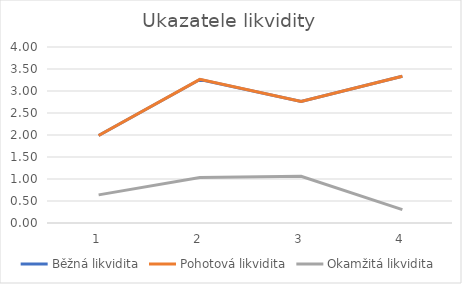
| Category | Běžná likvidita | Pohotová likvidita | Okamžitá likvidita |
|---|---|---|---|
| 0 | 1.99 | 1.987 | 0.639 |
| 1 | 3.26 | 3.264 | 1.035 |
| 2 | 2.76 | 2.761 | 1.062 |
| 3 | 3.337 | 3.337 | 0.303 |